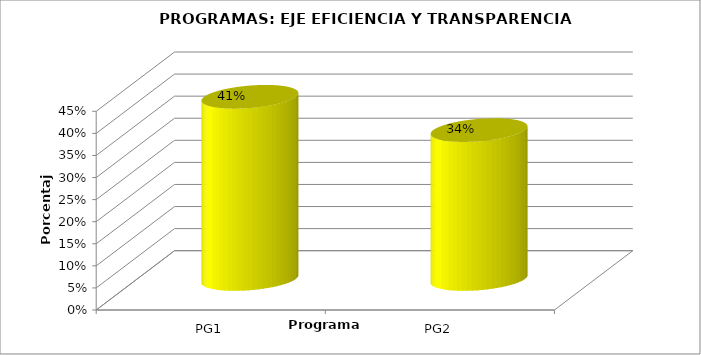
| Category | Series 0 |
|---|---|
| PG1 | 0.413 |
| PG2 | 0.337 |